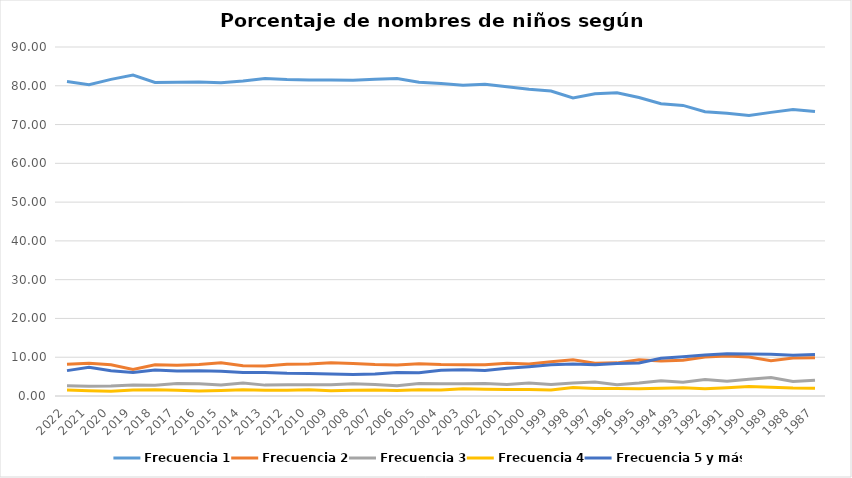
| Category | Frecuencia 1 | Frecuencia 2 | Frecuencia 3 | Frecuencia 4 | Frecuencia 5 y más |
|---|---|---|---|---|---|
| 2022.0 | 81.094 | 8.189 | 2.614 | 1.558 | 6.544 |
| 2021.0 | 80.285 | 8.464 | 2.503 | 1.322 | 7.426 |
| 2020.0 | 81.653 | 8.074 | 2.56 | 1.203 | 6.511 |
| 2019.0 | 82.744 | 6.845 | 2.843 | 1.519 | 6.048 |
| 2018.0 | 80.876 | 8.045 | 2.761 | 1.602 | 6.716 |
| 2017.0 | 80.906 | 7.927 | 3.24 | 1.481 | 6.446 |
| 2016.0 | 80.955 | 8.122 | 3.133 | 1.26 | 6.531 |
| 2015.0 | 80.76 | 8.568 | 2.867 | 1.391 | 6.413 |
| 2014.0 | 81.252 | 7.793 | 3.342 | 1.581 | 6.032 |
| 2013.0 | 81.875 | 7.754 | 2.805 | 1.513 | 6.052 |
| 2012.0 | 81.595 | 8.185 | 2.918 | 1.451 | 5.851 |
| 2010.0 | 81.494 | 8.234 | 2.869 | 1.58 | 5.822 |
| 2009.0 | 81.471 | 8.565 | 2.904 | 1.385 | 5.674 |
| 2008.0 | 81.418 | 8.395 | 3.161 | 1.485 | 5.541 |
| 2007.0 | 81.699 | 8.103 | 2.99 | 1.565 | 5.644 |
| 2006.0 | 81.873 | 7.97 | 2.63 | 1.442 | 6.085 |
| 2005.0 | 80.905 | 8.315 | 3.202 | 1.593 | 5.985 |
| 2004.0 | 80.557 | 8.12 | 3.15 | 1.558 | 6.615 |
| 2003.0 | 80.137 | 8.075 | 3.161 | 1.866 | 6.761 |
| 2002.0 | 80.421 | 8.05 | 3.236 | 1.739 | 6.553 |
| 2001.0 | 79.764 | 8.428 | 2.98 | 1.668 | 7.16 |
| 2000.0 | 79.129 | 8.232 | 3.372 | 1.699 | 7.568 |
| 1999.0 | 78.65 | 8.809 | 2.986 | 1.523 | 8.032 |
| 1998.0 | 76.875 | 9.323 | 3.351 | 2.19 | 8.261 |
| 1997.0 | 77.94 | 8.472 | 3.626 | 1.932 | 8.031 |
| 1996.0 | 78.178 | 8.545 | 2.931 | 1.942 | 8.404 |
| 1995.0 | 76.964 | 9.342 | 3.326 | 1.84 | 8.528 |
| 1994.0 | 75.361 | 9.011 | 3.916 | 1.977 | 9.734 |
| 1993.0 | 74.942 | 9.232 | 3.569 | 2.133 | 10.124 |
| 1992.0 | 73.318 | 10.055 | 4.225 | 1.839 | 10.563 |
| 1991.0 | 72.889 | 10.3 | 3.788 | 2.131 | 10.892 |
| 1990.0 | 72.366 | 10.06 | 4.294 | 2.465 | 10.815 |
| 1989.0 | 73.141 | 9.102 | 4.754 | 2.235 | 10.768 |
| 1988.0 | 73.91 | 9.784 | 3.733 | 2.043 | 10.53 |
| 1987.0 | 73.377 | 9.833 | 4.081 | 1.982 | 10.727 |